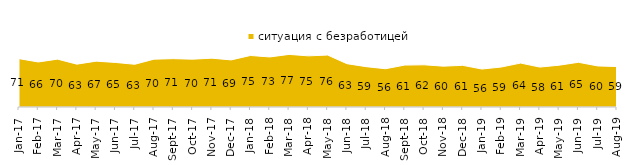
| Category | ситуация с безработицей |
|---|---|
| 2017-01-01 | 70.75 |
| 2017-02-01 | 65.9 |
| 2017-03-01 | 70.05 |
| 2017-04-01 | 62.7 |
| 2017-05-01 | 67.1 |
| 2017-06-01 | 65.2 |
| 2017-07-01 | 62.5 |
| 2017-08-01 | 70 |
| 2017-09-01 | 70.75 |
| 2017-10-01 | 70 |
| 2017-11-01 | 71.45 |
| 2017-12-01 | 68.9 |
| 2018-01-01 | 75.4 |
| 2018-02-01 | 73.25 |
| 2018-03-01 | 76.95 |
| 2018-04-01 | 74.85 |
| 2018-05-01 | 76 |
| 2018-06-01 | 63.4 |
| 2018-07-01 | 59 |
| 2018-08-01 | 56 |
| 2018-09-01 | 61.35 |
| 2018-10-01 | 61.75 |
| 2018-11-01 | 59.78 |
| 2018-12-01 | 60.95 |
| 2019-01-01 | 55.55 |
| 2019-02-01 | 58.5 |
| 2019-03-01 | 64.296 |
| 2019-04-01 | 58.416 |
| 2019-05-01 | 61.169 |
| 2019-06-01 | 65.436 |
| 2019-07-01 | 60.099 |
| 2019-08-01 | 59.241 |